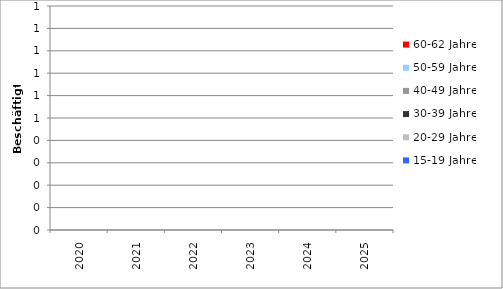
| Category | 15-19 Jahre | 20-29 Jahre | 30-39 Jahre | 40-49 Jahre | 50-59 Jahre | 60-62 Jahre |
|---|---|---|---|---|---|---|
| 2020.0 | 7 | 6 | 15 | 115 | 3 | 3 |
| 2021.0 | 7 | 6 | 11 | 119 | 4 | 2 |
| 2022.0 | 5 | 8 | 8 | 118 | 8.9 | 0 |
| 2023.0 | 5 | 8 | 6 | 120 | 9.7 | 0 |
| 2024.0 | 5 | 8 | 5 | 121 | 9.4 | 0 |
| 2025.0 | 0 | 8 | 10 | 121 | 9 | 1.2 |